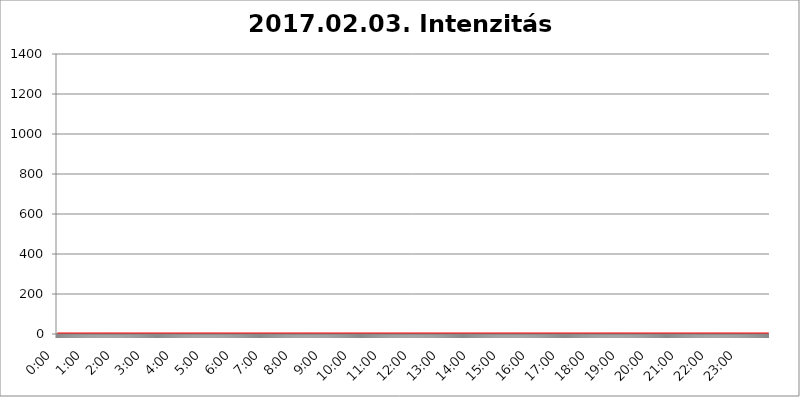
| Category | 2017.02.03. Intenzitás [W/m^2] |
|---|---|
| 0.0 | 0 |
| 0.0006944444444444445 | 0 |
| 0.001388888888888889 | 0 |
| 0.0020833333333333333 | 0 |
| 0.002777777777777778 | 0 |
| 0.003472222222222222 | 0 |
| 0.004166666666666667 | 0 |
| 0.004861111111111111 | 0 |
| 0.005555555555555556 | 0 |
| 0.0062499999999999995 | 0 |
| 0.006944444444444444 | 0 |
| 0.007638888888888889 | 0 |
| 0.008333333333333333 | 0 |
| 0.009027777777777779 | 0 |
| 0.009722222222222222 | 0 |
| 0.010416666666666666 | 0 |
| 0.011111111111111112 | 0 |
| 0.011805555555555555 | 0 |
| 0.012499999999999999 | 0 |
| 0.013194444444444444 | 0 |
| 0.013888888888888888 | 0 |
| 0.014583333333333332 | 0 |
| 0.015277777777777777 | 0 |
| 0.015972222222222224 | 0 |
| 0.016666666666666666 | 0 |
| 0.017361111111111112 | 0 |
| 0.018055555555555557 | 0 |
| 0.01875 | 0 |
| 0.019444444444444445 | 0 |
| 0.02013888888888889 | 0 |
| 0.020833333333333332 | 0 |
| 0.02152777777777778 | 0 |
| 0.022222222222222223 | 0 |
| 0.02291666666666667 | 0 |
| 0.02361111111111111 | 0 |
| 0.024305555555555556 | 0 |
| 0.024999999999999998 | 0 |
| 0.025694444444444447 | 0 |
| 0.02638888888888889 | 0 |
| 0.027083333333333334 | 0 |
| 0.027777777777777776 | 0 |
| 0.02847222222222222 | 0 |
| 0.029166666666666664 | 0 |
| 0.029861111111111113 | 0 |
| 0.030555555555555555 | 0 |
| 0.03125 | 0 |
| 0.03194444444444445 | 0 |
| 0.03263888888888889 | 0 |
| 0.03333333333333333 | 0 |
| 0.034027777777777775 | 0 |
| 0.034722222222222224 | 0 |
| 0.035416666666666666 | 0 |
| 0.036111111111111115 | 0 |
| 0.03680555555555556 | 0 |
| 0.0375 | 0 |
| 0.03819444444444444 | 0 |
| 0.03888888888888889 | 0 |
| 0.03958333333333333 | 0 |
| 0.04027777777777778 | 0 |
| 0.04097222222222222 | 0 |
| 0.041666666666666664 | 0 |
| 0.042361111111111106 | 0 |
| 0.04305555555555556 | 0 |
| 0.043750000000000004 | 0 |
| 0.044444444444444446 | 0 |
| 0.04513888888888889 | 0 |
| 0.04583333333333334 | 0 |
| 0.04652777777777778 | 0 |
| 0.04722222222222222 | 0 |
| 0.04791666666666666 | 0 |
| 0.04861111111111111 | 0 |
| 0.049305555555555554 | 0 |
| 0.049999999999999996 | 0 |
| 0.05069444444444445 | 0 |
| 0.051388888888888894 | 0 |
| 0.052083333333333336 | 0 |
| 0.05277777777777778 | 0 |
| 0.05347222222222222 | 0 |
| 0.05416666666666667 | 0 |
| 0.05486111111111111 | 0 |
| 0.05555555555555555 | 0 |
| 0.05625 | 0 |
| 0.05694444444444444 | 0 |
| 0.057638888888888885 | 0 |
| 0.05833333333333333 | 0 |
| 0.05902777777777778 | 0 |
| 0.059722222222222225 | 0 |
| 0.06041666666666667 | 0 |
| 0.061111111111111116 | 0 |
| 0.06180555555555556 | 0 |
| 0.0625 | 0 |
| 0.06319444444444444 | 0 |
| 0.06388888888888888 | 0 |
| 0.06458333333333334 | 0 |
| 0.06527777777777778 | 0 |
| 0.06597222222222222 | 0 |
| 0.06666666666666667 | 0 |
| 0.06736111111111111 | 0 |
| 0.06805555555555555 | 0 |
| 0.06874999999999999 | 0 |
| 0.06944444444444443 | 0 |
| 0.07013888888888889 | 0 |
| 0.07083333333333333 | 0 |
| 0.07152777777777779 | 0 |
| 0.07222222222222223 | 0 |
| 0.07291666666666667 | 0 |
| 0.07361111111111111 | 0 |
| 0.07430555555555556 | 0 |
| 0.075 | 0 |
| 0.07569444444444444 | 0 |
| 0.0763888888888889 | 0 |
| 0.07708333333333334 | 0 |
| 0.07777777777777778 | 0 |
| 0.07847222222222222 | 0 |
| 0.07916666666666666 | 0 |
| 0.0798611111111111 | 0 |
| 0.08055555555555556 | 0 |
| 0.08125 | 0 |
| 0.08194444444444444 | 0 |
| 0.08263888888888889 | 0 |
| 0.08333333333333333 | 0 |
| 0.08402777777777777 | 0 |
| 0.08472222222222221 | 0 |
| 0.08541666666666665 | 0 |
| 0.08611111111111112 | 0 |
| 0.08680555555555557 | 0 |
| 0.08750000000000001 | 0 |
| 0.08819444444444445 | 0 |
| 0.08888888888888889 | 0 |
| 0.08958333333333333 | 0 |
| 0.09027777777777778 | 0 |
| 0.09097222222222222 | 0 |
| 0.09166666666666667 | 0 |
| 0.09236111111111112 | 0 |
| 0.09305555555555556 | 0 |
| 0.09375 | 0 |
| 0.09444444444444444 | 0 |
| 0.09513888888888888 | 0 |
| 0.09583333333333333 | 0 |
| 0.09652777777777777 | 0 |
| 0.09722222222222222 | 0 |
| 0.09791666666666667 | 0 |
| 0.09861111111111111 | 0 |
| 0.09930555555555555 | 0 |
| 0.09999999999999999 | 0 |
| 0.10069444444444443 | 0 |
| 0.1013888888888889 | 0 |
| 0.10208333333333335 | 0 |
| 0.10277777777777779 | 0 |
| 0.10347222222222223 | 0 |
| 0.10416666666666667 | 0 |
| 0.10486111111111111 | 0 |
| 0.10555555555555556 | 0 |
| 0.10625 | 0 |
| 0.10694444444444444 | 0 |
| 0.1076388888888889 | 0 |
| 0.10833333333333334 | 0 |
| 0.10902777777777778 | 0 |
| 0.10972222222222222 | 0 |
| 0.1111111111111111 | 0 |
| 0.11180555555555556 | 0 |
| 0.11180555555555556 | 0 |
| 0.1125 | 0 |
| 0.11319444444444444 | 0 |
| 0.11388888888888889 | 0 |
| 0.11458333333333333 | 0 |
| 0.11527777777777777 | 0 |
| 0.11597222222222221 | 0 |
| 0.11666666666666665 | 0 |
| 0.1173611111111111 | 0 |
| 0.11805555555555557 | 0 |
| 0.11944444444444445 | 0 |
| 0.12013888888888889 | 0 |
| 0.12083333333333333 | 0 |
| 0.12152777777777778 | 0 |
| 0.12222222222222223 | 0 |
| 0.12291666666666667 | 0 |
| 0.12291666666666667 | 0 |
| 0.12361111111111112 | 0 |
| 0.12430555555555556 | 0 |
| 0.125 | 0 |
| 0.12569444444444444 | 0 |
| 0.12638888888888888 | 0 |
| 0.12708333333333333 | 0 |
| 0.16875 | 0 |
| 0.12847222222222224 | 0 |
| 0.12916666666666668 | 0 |
| 0.12986111111111112 | 0 |
| 0.13055555555555556 | 0 |
| 0.13125 | 0 |
| 0.13194444444444445 | 0 |
| 0.1326388888888889 | 0 |
| 0.13333333333333333 | 0 |
| 0.13402777777777777 | 0 |
| 0.13402777777777777 | 0 |
| 0.13472222222222222 | 0 |
| 0.13541666666666666 | 0 |
| 0.1361111111111111 | 0 |
| 0.13749999999999998 | 0 |
| 0.13819444444444443 | 0 |
| 0.1388888888888889 | 0 |
| 0.13958333333333334 | 0 |
| 0.14027777777777778 | 0 |
| 0.14097222222222222 | 0 |
| 0.14166666666666666 | 0 |
| 0.1423611111111111 | 0 |
| 0.14305555555555557 | 0 |
| 0.14375000000000002 | 0 |
| 0.14444444444444446 | 0 |
| 0.1451388888888889 | 0 |
| 0.1451388888888889 | 0 |
| 0.14652777777777778 | 0 |
| 0.14722222222222223 | 0 |
| 0.14791666666666667 | 0 |
| 0.1486111111111111 | 0 |
| 0.14930555555555555 | 0 |
| 0.15 | 0 |
| 0.15069444444444444 | 0 |
| 0.15138888888888888 | 0 |
| 0.15208333333333332 | 0 |
| 0.15277777777777776 | 0 |
| 0.15347222222222223 | 0 |
| 0.15416666666666667 | 0 |
| 0.15486111111111112 | 0 |
| 0.15555555555555556 | 0 |
| 0.15625 | 0 |
| 0.15694444444444444 | 0 |
| 0.15763888888888888 | 0 |
| 0.15833333333333333 | 0 |
| 0.15902777777777777 | 0 |
| 0.15972222222222224 | 0 |
| 0.16041666666666668 | 0 |
| 0.16111111111111112 | 0 |
| 0.16180555555555556 | 0 |
| 0.1625 | 0 |
| 0.16319444444444445 | 0 |
| 0.1638888888888889 | 0 |
| 0.16458333333333333 | 0 |
| 0.16527777777777777 | 0 |
| 0.16597222222222222 | 0 |
| 0.16666666666666666 | 0 |
| 0.1673611111111111 | 0 |
| 0.16805555555555554 | 0 |
| 0.16874999999999998 | 0 |
| 0.16944444444444443 | 0 |
| 0.17013888888888887 | 0 |
| 0.1708333333333333 | 0 |
| 0.17152777777777775 | 0 |
| 0.17222222222222225 | 0 |
| 0.1729166666666667 | 0 |
| 0.17361111111111113 | 0 |
| 0.17430555555555557 | 0 |
| 0.17500000000000002 | 0 |
| 0.17569444444444446 | 0 |
| 0.1763888888888889 | 0 |
| 0.17708333333333334 | 0 |
| 0.17777777777777778 | 0 |
| 0.17847222222222223 | 0 |
| 0.17916666666666667 | 0 |
| 0.1798611111111111 | 0 |
| 0.18055555555555555 | 0 |
| 0.18125 | 0 |
| 0.18194444444444444 | 0 |
| 0.1826388888888889 | 0 |
| 0.18333333333333335 | 0 |
| 0.1840277777777778 | 0 |
| 0.18472222222222223 | 0 |
| 0.18541666666666667 | 0 |
| 0.18611111111111112 | 0 |
| 0.18680555555555556 | 0 |
| 0.1875 | 0 |
| 0.18819444444444444 | 0 |
| 0.18888888888888888 | 0 |
| 0.18958333333333333 | 0 |
| 0.19027777777777777 | 0 |
| 0.1909722222222222 | 0 |
| 0.19166666666666665 | 0 |
| 0.19236111111111112 | 0 |
| 0.19305555555555554 | 0 |
| 0.19375 | 0 |
| 0.19444444444444445 | 0 |
| 0.1951388888888889 | 0 |
| 0.19583333333333333 | 0 |
| 0.19652777777777777 | 0 |
| 0.19722222222222222 | 0 |
| 0.19791666666666666 | 0 |
| 0.1986111111111111 | 0 |
| 0.19930555555555554 | 0 |
| 0.19999999999999998 | 0 |
| 0.20069444444444443 | 0 |
| 0.20138888888888887 | 0 |
| 0.2020833333333333 | 0 |
| 0.2027777777777778 | 0 |
| 0.2034722222222222 | 0 |
| 0.2041666666666667 | 0 |
| 0.20486111111111113 | 0 |
| 0.20555555555555557 | 0 |
| 0.20625000000000002 | 0 |
| 0.20694444444444446 | 0 |
| 0.2076388888888889 | 0 |
| 0.20833333333333334 | 0 |
| 0.20902777777777778 | 0 |
| 0.20972222222222223 | 0 |
| 0.21041666666666667 | 0 |
| 0.2111111111111111 | 0 |
| 0.21180555555555555 | 0 |
| 0.2125 | 0 |
| 0.21319444444444444 | 0 |
| 0.2138888888888889 | 0 |
| 0.21458333333333335 | 0 |
| 0.2152777777777778 | 0 |
| 0.21597222222222223 | 0 |
| 0.21666666666666667 | 0 |
| 0.21736111111111112 | 0 |
| 0.21805555555555556 | 0 |
| 0.21875 | 0 |
| 0.21944444444444444 | 0 |
| 0.22013888888888888 | 0 |
| 0.22083333333333333 | 0 |
| 0.22152777777777777 | 0 |
| 0.2222222222222222 | 0 |
| 0.22291666666666665 | 0 |
| 0.2236111111111111 | 0 |
| 0.22430555555555556 | 0 |
| 0.225 | 0 |
| 0.22569444444444445 | 0 |
| 0.2263888888888889 | 0 |
| 0.22708333333333333 | 0 |
| 0.22777777777777777 | 0 |
| 0.22847222222222222 | 0 |
| 0.22916666666666666 | 0 |
| 0.2298611111111111 | 0 |
| 0.23055555555555554 | 0 |
| 0.23124999999999998 | 0 |
| 0.23194444444444443 | 0 |
| 0.23263888888888887 | 0 |
| 0.2333333333333333 | 0 |
| 0.2340277777777778 | 0 |
| 0.2347222222222222 | 0 |
| 0.2354166666666667 | 0 |
| 0.23611111111111113 | 0 |
| 0.23680555555555557 | 0 |
| 0.23750000000000002 | 0 |
| 0.23819444444444446 | 0 |
| 0.2388888888888889 | 0 |
| 0.23958333333333334 | 0 |
| 0.24027777777777778 | 0 |
| 0.24097222222222223 | 0 |
| 0.24166666666666667 | 0 |
| 0.2423611111111111 | 0 |
| 0.24305555555555555 | 0 |
| 0.24375 | 0 |
| 0.24444444444444446 | 0 |
| 0.24513888888888888 | 0 |
| 0.24583333333333335 | 0 |
| 0.2465277777777778 | 0 |
| 0.24722222222222223 | 0 |
| 0.24791666666666667 | 0 |
| 0.24861111111111112 | 0 |
| 0.24930555555555556 | 0 |
| 0.25 | 0 |
| 0.25069444444444444 | 0 |
| 0.2513888888888889 | 0 |
| 0.2520833333333333 | 0 |
| 0.25277777777777777 | 0 |
| 0.2534722222222222 | 0 |
| 0.25416666666666665 | 0 |
| 0.2548611111111111 | 0 |
| 0.2555555555555556 | 0 |
| 0.25625000000000003 | 0 |
| 0.2569444444444445 | 0 |
| 0.2576388888888889 | 0 |
| 0.25833333333333336 | 0 |
| 0.2590277777777778 | 0 |
| 0.25972222222222224 | 0 |
| 0.2604166666666667 | 0 |
| 0.2611111111111111 | 0 |
| 0.26180555555555557 | 0 |
| 0.2625 | 0 |
| 0.26319444444444445 | 0 |
| 0.2638888888888889 | 0 |
| 0.26458333333333334 | 0 |
| 0.2652777777777778 | 0 |
| 0.2659722222222222 | 0 |
| 0.26666666666666666 | 0 |
| 0.2673611111111111 | 0 |
| 0.26805555555555555 | 0 |
| 0.26875 | 0 |
| 0.26944444444444443 | 0 |
| 0.2701388888888889 | 0 |
| 0.2708333333333333 | 0 |
| 0.27152777777777776 | 0 |
| 0.2722222222222222 | 0 |
| 0.27291666666666664 | 0 |
| 0.2736111111111111 | 0 |
| 0.2743055555555555 | 0 |
| 0.27499999999999997 | 0 |
| 0.27569444444444446 | 0 |
| 0.27638888888888885 | 0 |
| 0.27708333333333335 | 0 |
| 0.2777777777777778 | 0 |
| 0.27847222222222223 | 0 |
| 0.2791666666666667 | 0 |
| 0.2798611111111111 | 0 |
| 0.28055555555555556 | 0 |
| 0.28125 | 0 |
| 0.28194444444444444 | 0 |
| 0.2826388888888889 | 0 |
| 0.2833333333333333 | 0 |
| 0.28402777777777777 | 0 |
| 0.2847222222222222 | 0 |
| 0.28541666666666665 | 0 |
| 0.28611111111111115 | 0 |
| 0.28680555555555554 | 0 |
| 0.28750000000000003 | 0 |
| 0.2881944444444445 | 0 |
| 0.2888888888888889 | 0 |
| 0.28958333333333336 | 0 |
| 0.2902777777777778 | 0 |
| 0.29097222222222224 | 0 |
| 0.2916666666666667 | 0 |
| 0.2923611111111111 | 0 |
| 0.29305555555555557 | 0 |
| 0.29375 | 0 |
| 0.29444444444444445 | 0 |
| 0.2951388888888889 | 0 |
| 0.29583333333333334 | 0 |
| 0.2965277777777778 | 0 |
| 0.2972222222222222 | 0 |
| 0.29791666666666666 | 0 |
| 0.2986111111111111 | 0 |
| 0.29930555555555555 | 0 |
| 0.3 | 0 |
| 0.30069444444444443 | 0 |
| 0.3013888888888889 | 0 |
| 0.3020833333333333 | 0 |
| 0.30277777777777776 | 0 |
| 0.3034722222222222 | 0 |
| 0.30416666666666664 | 0 |
| 0.3048611111111111 | 0 |
| 0.3055555555555555 | 0 |
| 0.30624999999999997 | 0 |
| 0.3069444444444444 | 0 |
| 0.3076388888888889 | 0 |
| 0.30833333333333335 | 0 |
| 0.3090277777777778 | 0 |
| 0.30972222222222223 | 0 |
| 0.3104166666666667 | 0 |
| 0.3111111111111111 | 0 |
| 0.31180555555555556 | 0 |
| 0.3125 | 0 |
| 0.31319444444444444 | 0 |
| 0.3138888888888889 | 0 |
| 0.3145833333333333 | 0 |
| 0.31527777777777777 | 0 |
| 0.3159722222222222 | 0 |
| 0.31666666666666665 | 0 |
| 0.31736111111111115 | 0 |
| 0.31805555555555554 | 0 |
| 0.31875000000000003 | 0 |
| 0.3194444444444445 | 0 |
| 0.3201388888888889 | 0 |
| 0.32083333333333336 | 0 |
| 0.3215277777777778 | 0 |
| 0.32222222222222224 | 0 |
| 0.3229166666666667 | 0 |
| 0.3236111111111111 | 0 |
| 0.32430555555555557 | 0 |
| 0.325 | 0 |
| 0.32569444444444445 | 0 |
| 0.3263888888888889 | 0 |
| 0.32708333333333334 | 0 |
| 0.3277777777777778 | 0 |
| 0.3284722222222222 | 0 |
| 0.32916666666666666 | 0 |
| 0.3298611111111111 | 0 |
| 0.33055555555555555 | 0 |
| 0.33125 | 0 |
| 0.33194444444444443 | 0 |
| 0.3326388888888889 | 0 |
| 0.3333333333333333 | 0 |
| 0.3340277777777778 | 0 |
| 0.3347222222222222 | 0 |
| 0.3354166666666667 | 0 |
| 0.3361111111111111 | 0 |
| 0.3368055555555556 | 0 |
| 0.33749999999999997 | 0 |
| 0.33819444444444446 | 0 |
| 0.33888888888888885 | 0 |
| 0.33958333333333335 | 0 |
| 0.34027777777777773 | 0 |
| 0.34097222222222223 | 0 |
| 0.3416666666666666 | 0 |
| 0.3423611111111111 | 0 |
| 0.3430555555555555 | 0 |
| 0.34375 | 0 |
| 0.3444444444444445 | 0 |
| 0.3451388888888889 | 0 |
| 0.3458333333333334 | 0 |
| 0.34652777777777777 | 0 |
| 0.34722222222222227 | 0 |
| 0.34791666666666665 | 0 |
| 0.34861111111111115 | 0 |
| 0.34930555555555554 | 0 |
| 0.35000000000000003 | 0 |
| 0.3506944444444444 | 0 |
| 0.3513888888888889 | 0 |
| 0.3520833333333333 | 0 |
| 0.3527777777777778 | 0 |
| 0.3534722222222222 | 0 |
| 0.3541666666666667 | 0 |
| 0.3548611111111111 | 0 |
| 0.35555555555555557 | 0 |
| 0.35625 | 0 |
| 0.35694444444444445 | 0 |
| 0.3576388888888889 | 0 |
| 0.35833333333333334 | 0 |
| 0.3590277777777778 | 0 |
| 0.3597222222222222 | 0 |
| 0.36041666666666666 | 0 |
| 0.3611111111111111 | 0 |
| 0.36180555555555555 | 0 |
| 0.3625 | 0 |
| 0.36319444444444443 | 0 |
| 0.3638888888888889 | 0 |
| 0.3645833333333333 | 0 |
| 0.3652777777777778 | 0 |
| 0.3659722222222222 | 0 |
| 0.3666666666666667 | 0 |
| 0.3673611111111111 | 0 |
| 0.3680555555555556 | 0 |
| 0.36874999999999997 | 0 |
| 0.36944444444444446 | 0 |
| 0.37013888888888885 | 0 |
| 0.37083333333333335 | 0 |
| 0.37152777777777773 | 0 |
| 0.37222222222222223 | 0 |
| 0.3729166666666666 | 0 |
| 0.3736111111111111 | 0 |
| 0.3743055555555555 | 0 |
| 0.375 | 0 |
| 0.3756944444444445 | 0 |
| 0.3763888888888889 | 0 |
| 0.3770833333333334 | 0 |
| 0.37777777777777777 | 0 |
| 0.37847222222222227 | 0 |
| 0.37916666666666665 | 0 |
| 0.37986111111111115 | 0 |
| 0.38055555555555554 | 0 |
| 0.38125000000000003 | 0 |
| 0.3819444444444444 | 0 |
| 0.3826388888888889 | 0 |
| 0.3833333333333333 | 0 |
| 0.3840277777777778 | 0 |
| 0.3847222222222222 | 0 |
| 0.3854166666666667 | 0 |
| 0.3861111111111111 | 0 |
| 0.38680555555555557 | 0 |
| 0.3875 | 0 |
| 0.38819444444444445 | 0 |
| 0.3888888888888889 | 0 |
| 0.38958333333333334 | 0 |
| 0.3902777777777778 | 0 |
| 0.3909722222222222 | 0 |
| 0.39166666666666666 | 0 |
| 0.3923611111111111 | 0 |
| 0.39305555555555555 | 0 |
| 0.39375 | 0 |
| 0.39444444444444443 | 0 |
| 0.3951388888888889 | 0 |
| 0.3958333333333333 | 0 |
| 0.3965277777777778 | 0 |
| 0.3972222222222222 | 0 |
| 0.3979166666666667 | 0 |
| 0.3986111111111111 | 0 |
| 0.3993055555555556 | 0 |
| 0.39999999999999997 | 0 |
| 0.40069444444444446 | 0 |
| 0.40138888888888885 | 0 |
| 0.40208333333333335 | 0 |
| 0.40277777777777773 | 0 |
| 0.40347222222222223 | 0 |
| 0.4041666666666666 | 0 |
| 0.4048611111111111 | 0 |
| 0.4055555555555555 | 0 |
| 0.40625 | 0 |
| 0.4069444444444445 | 0 |
| 0.4076388888888889 | 0 |
| 0.4083333333333334 | 0 |
| 0.40902777777777777 | 0 |
| 0.40972222222222227 | 0 |
| 0.41041666666666665 | 0 |
| 0.41111111111111115 | 0 |
| 0.41180555555555554 | 0 |
| 0.41250000000000003 | 0 |
| 0.4131944444444444 | 0 |
| 0.4138888888888889 | 0 |
| 0.4145833333333333 | 0 |
| 0.4152777777777778 | 0 |
| 0.4159722222222222 | 0 |
| 0.4166666666666667 | 0 |
| 0.4173611111111111 | 0 |
| 0.41805555555555557 | 0 |
| 0.41875 | 0 |
| 0.41944444444444445 | 0 |
| 0.4201388888888889 | 0 |
| 0.42083333333333334 | 0 |
| 0.4215277777777778 | 0 |
| 0.4222222222222222 | 0 |
| 0.42291666666666666 | 0 |
| 0.4236111111111111 | 0 |
| 0.42430555555555555 | 0 |
| 0.425 | 0 |
| 0.42569444444444443 | 0 |
| 0.4263888888888889 | 0 |
| 0.4270833333333333 | 0 |
| 0.4277777777777778 | 0 |
| 0.4284722222222222 | 0 |
| 0.4291666666666667 | 0 |
| 0.4298611111111111 | 0 |
| 0.4305555555555556 | 0 |
| 0.43124999999999997 | 0 |
| 0.43194444444444446 | 0 |
| 0.43263888888888885 | 0 |
| 0.43333333333333335 | 0 |
| 0.43402777777777773 | 0 |
| 0.43472222222222223 | 0 |
| 0.4354166666666666 | 0 |
| 0.4361111111111111 | 0 |
| 0.4368055555555555 | 0 |
| 0.4375 | 0 |
| 0.4381944444444445 | 0 |
| 0.4388888888888889 | 0 |
| 0.4395833333333334 | 0 |
| 0.44027777777777777 | 0 |
| 0.44097222222222227 | 0 |
| 0.44166666666666665 | 0 |
| 0.44236111111111115 | 0 |
| 0.44305555555555554 | 0 |
| 0.44375000000000003 | 0 |
| 0.4444444444444444 | 0 |
| 0.4451388888888889 | 0 |
| 0.4458333333333333 | 0 |
| 0.4465277777777778 | 0 |
| 0.4472222222222222 | 0 |
| 0.4479166666666667 | 0 |
| 0.4486111111111111 | 0 |
| 0.44930555555555557 | 0 |
| 0.45 | 0 |
| 0.45069444444444445 | 0 |
| 0.4513888888888889 | 0 |
| 0.45208333333333334 | 0 |
| 0.4527777777777778 | 0 |
| 0.4534722222222222 | 0 |
| 0.45416666666666666 | 0 |
| 0.4548611111111111 | 0 |
| 0.45555555555555555 | 0 |
| 0.45625 | 0 |
| 0.45694444444444443 | 0 |
| 0.4576388888888889 | 0 |
| 0.4583333333333333 | 0 |
| 0.4590277777777778 | 0 |
| 0.4597222222222222 | 0 |
| 0.4604166666666667 | 0 |
| 0.4611111111111111 | 0 |
| 0.4618055555555556 | 0 |
| 0.46249999999999997 | 0 |
| 0.46319444444444446 | 0 |
| 0.46388888888888885 | 0 |
| 0.46458333333333335 | 0 |
| 0.46527777777777773 | 0 |
| 0.46597222222222223 | 0 |
| 0.4666666666666666 | 0 |
| 0.4673611111111111 | 0 |
| 0.4680555555555555 | 0 |
| 0.46875 | 0 |
| 0.4694444444444445 | 0 |
| 0.4701388888888889 | 0 |
| 0.4708333333333334 | 0 |
| 0.47152777777777777 | 0 |
| 0.47222222222222227 | 0 |
| 0.47291666666666665 | 0 |
| 0.47361111111111115 | 0 |
| 0.47430555555555554 | 0 |
| 0.47500000000000003 | 0 |
| 0.4756944444444444 | 0 |
| 0.4763888888888889 | 0 |
| 0.4770833333333333 | 0 |
| 0.4777777777777778 | 0 |
| 0.4784722222222222 | 0 |
| 0.4791666666666667 | 0 |
| 0.4798611111111111 | 0 |
| 0.48055555555555557 | 0 |
| 0.48125 | 0 |
| 0.48194444444444445 | 0 |
| 0.4826388888888889 | 0 |
| 0.48333333333333334 | 0 |
| 0.4840277777777778 | 0 |
| 0.4847222222222222 | 0 |
| 0.48541666666666666 | 0 |
| 0.4861111111111111 | 0 |
| 0.48680555555555555 | 0 |
| 0.4875 | 0 |
| 0.48819444444444443 | 0 |
| 0.4888888888888889 | 0 |
| 0.4895833333333333 | 0 |
| 0.4902777777777778 | 0 |
| 0.4909722222222222 | 0 |
| 0.4916666666666667 | 0 |
| 0.4923611111111111 | 0 |
| 0.4930555555555556 | 0 |
| 0.49374999999999997 | 0 |
| 0.49444444444444446 | 0 |
| 0.49513888888888885 | 0 |
| 0.49583333333333335 | 0 |
| 0.49652777777777773 | 0 |
| 0.49722222222222223 | 0 |
| 0.4979166666666666 | 0 |
| 0.4986111111111111 | 0 |
| 0.4993055555555555 | 0 |
| 0.5 | 0 |
| 0.5006944444444444 | 0 |
| 0.5013888888888889 | 0 |
| 0.5020833333333333 | 0 |
| 0.5027777777777778 | 0 |
| 0.5034722222222222 | 0 |
| 0.5041666666666667 | 0 |
| 0.5048611111111111 | 0 |
| 0.5055555555555555 | 0 |
| 0.50625 | 0 |
| 0.5069444444444444 | 0 |
| 0.5076388888888889 | 0 |
| 0.5083333333333333 | 0 |
| 0.5090277777777777 | 0 |
| 0.5097222222222222 | 0 |
| 0.5104166666666666 | 0 |
| 0.5111111111111112 | 0 |
| 0.5118055555555555 | 0 |
| 0.5125000000000001 | 0 |
| 0.5131944444444444 | 0 |
| 0.513888888888889 | 0 |
| 0.5145833333333333 | 0 |
| 0.5152777777777778 | 0 |
| 0.5159722222222222 | 0 |
| 0.5166666666666667 | 0 |
| 0.517361111111111 | 0 |
| 0.5180555555555556 | 0 |
| 0.5187499999999999 | 0 |
| 0.5194444444444445 | 0 |
| 0.5201388888888888 | 0 |
| 0.5208333333333334 | 0 |
| 0.5215277777777778 | 0 |
| 0.5222222222222223 | 0 |
| 0.5229166666666667 | 0 |
| 0.5236111111111111 | 0 |
| 0.5243055555555556 | 0 |
| 0.525 | 0 |
| 0.5256944444444445 | 0 |
| 0.5263888888888889 | 0 |
| 0.5270833333333333 | 0 |
| 0.5277777777777778 | 0 |
| 0.5284722222222222 | 0 |
| 0.5291666666666667 | 0 |
| 0.5298611111111111 | 0 |
| 0.5305555555555556 | 0 |
| 0.53125 | 0 |
| 0.5319444444444444 | 0 |
| 0.5326388888888889 | 0 |
| 0.5333333333333333 | 0 |
| 0.5340277777777778 | 0 |
| 0.5347222222222222 | 0 |
| 0.5354166666666667 | 0 |
| 0.5361111111111111 | 0 |
| 0.5368055555555555 | 0 |
| 0.5375 | 0 |
| 0.5381944444444444 | 0 |
| 0.5388888888888889 | 0 |
| 0.5395833333333333 | 0 |
| 0.5402777777777777 | 0 |
| 0.5409722222222222 | 0 |
| 0.5416666666666666 | 0 |
| 0.5423611111111112 | 0 |
| 0.5430555555555555 | 0 |
| 0.5437500000000001 | 0 |
| 0.5444444444444444 | 0 |
| 0.545138888888889 | 0 |
| 0.5458333333333333 | 0 |
| 0.5465277777777778 | 0 |
| 0.5472222222222222 | 0 |
| 0.5479166666666667 | 0 |
| 0.548611111111111 | 0 |
| 0.5493055555555556 | 0 |
| 0.5499999999999999 | 0 |
| 0.5506944444444445 | 0 |
| 0.5513888888888888 | 0 |
| 0.5520833333333334 | 0 |
| 0.5527777777777778 | 0 |
| 0.5534722222222223 | 0 |
| 0.5541666666666667 | 0 |
| 0.5548611111111111 | 0 |
| 0.5555555555555556 | 0 |
| 0.55625 | 0 |
| 0.5569444444444445 | 0 |
| 0.5576388888888889 | 0 |
| 0.5583333333333333 | 0 |
| 0.5590277777777778 | 0 |
| 0.5597222222222222 | 0 |
| 0.5604166666666667 | 0 |
| 0.5611111111111111 | 0 |
| 0.5618055555555556 | 0 |
| 0.5625 | 0 |
| 0.5631944444444444 | 0 |
| 0.5638888888888889 | 0 |
| 0.5645833333333333 | 0 |
| 0.5652777777777778 | 0 |
| 0.5659722222222222 | 0 |
| 0.5666666666666667 | 0 |
| 0.5673611111111111 | 0 |
| 0.5680555555555555 | 0 |
| 0.56875 | 0 |
| 0.5694444444444444 | 0 |
| 0.5701388888888889 | 0 |
| 0.5708333333333333 | 0 |
| 0.5715277777777777 | 0 |
| 0.5722222222222222 | 0 |
| 0.5729166666666666 | 0 |
| 0.5736111111111112 | 0 |
| 0.5743055555555555 | 0 |
| 0.5750000000000001 | 0 |
| 0.5756944444444444 | 0 |
| 0.576388888888889 | 0 |
| 0.5770833333333333 | 0 |
| 0.5777777777777778 | 0 |
| 0.5784722222222222 | 0 |
| 0.5791666666666667 | 0 |
| 0.579861111111111 | 0 |
| 0.5805555555555556 | 0 |
| 0.5812499999999999 | 0 |
| 0.5819444444444445 | 0 |
| 0.5826388888888888 | 0 |
| 0.5833333333333334 | 0 |
| 0.5840277777777778 | 0 |
| 0.5847222222222223 | 0 |
| 0.5854166666666667 | 0 |
| 0.5861111111111111 | 0 |
| 0.5868055555555556 | 0 |
| 0.5875 | 0 |
| 0.5881944444444445 | 0 |
| 0.5888888888888889 | 0 |
| 0.5895833333333333 | 0 |
| 0.5902777777777778 | 0 |
| 0.5909722222222222 | 0 |
| 0.5916666666666667 | 0 |
| 0.5923611111111111 | 0 |
| 0.5930555555555556 | 0 |
| 0.59375 | 0 |
| 0.5944444444444444 | 0 |
| 0.5951388888888889 | 0 |
| 0.5958333333333333 | 0 |
| 0.5965277777777778 | 0 |
| 0.5972222222222222 | 0 |
| 0.5979166666666667 | 0 |
| 0.5986111111111111 | 0 |
| 0.5993055555555555 | 0 |
| 0.6 | 0 |
| 0.6006944444444444 | 0 |
| 0.6013888888888889 | 0 |
| 0.6020833333333333 | 0 |
| 0.6027777777777777 | 0 |
| 0.6034722222222222 | 0 |
| 0.6041666666666666 | 0 |
| 0.6048611111111112 | 0 |
| 0.6055555555555555 | 0 |
| 0.6062500000000001 | 0 |
| 0.6069444444444444 | 0 |
| 0.607638888888889 | 0 |
| 0.6083333333333333 | 0 |
| 0.6090277777777778 | 0 |
| 0.6097222222222222 | 0 |
| 0.6104166666666667 | 0 |
| 0.611111111111111 | 0 |
| 0.6118055555555556 | 0 |
| 0.6124999999999999 | 0 |
| 0.6131944444444445 | 0 |
| 0.6138888888888888 | 0 |
| 0.6145833333333334 | 0 |
| 0.6152777777777778 | 0 |
| 0.6159722222222223 | 0 |
| 0.6166666666666667 | 0 |
| 0.6173611111111111 | 0 |
| 0.6180555555555556 | 0 |
| 0.61875 | 0 |
| 0.6194444444444445 | 0 |
| 0.6201388888888889 | 0 |
| 0.6208333333333333 | 0 |
| 0.6215277777777778 | 0 |
| 0.6222222222222222 | 0 |
| 0.6229166666666667 | 0 |
| 0.6236111111111111 | 0 |
| 0.6243055555555556 | 0 |
| 0.625 | 0 |
| 0.6256944444444444 | 0 |
| 0.6263888888888889 | 0 |
| 0.6270833333333333 | 0 |
| 0.6277777777777778 | 0 |
| 0.6284722222222222 | 0 |
| 0.6291666666666667 | 0 |
| 0.6298611111111111 | 0 |
| 0.6305555555555555 | 0 |
| 0.63125 | 0 |
| 0.6319444444444444 | 0 |
| 0.6326388888888889 | 0 |
| 0.6333333333333333 | 0 |
| 0.6340277777777777 | 0 |
| 0.6347222222222222 | 0 |
| 0.6354166666666666 | 0 |
| 0.6361111111111112 | 0 |
| 0.6368055555555555 | 0 |
| 0.6375000000000001 | 0 |
| 0.6381944444444444 | 0 |
| 0.638888888888889 | 0 |
| 0.6395833333333333 | 0 |
| 0.6402777777777778 | 0 |
| 0.6409722222222222 | 0 |
| 0.6416666666666667 | 0 |
| 0.642361111111111 | 0 |
| 0.6430555555555556 | 0 |
| 0.6437499999999999 | 0 |
| 0.6444444444444445 | 0 |
| 0.6451388888888888 | 0 |
| 0.6458333333333334 | 0 |
| 0.6465277777777778 | 0 |
| 0.6472222222222223 | 0 |
| 0.6479166666666667 | 0 |
| 0.6486111111111111 | 0 |
| 0.6493055555555556 | 0 |
| 0.65 | 0 |
| 0.6506944444444445 | 0 |
| 0.6513888888888889 | 0 |
| 0.6520833333333333 | 0 |
| 0.6527777777777778 | 0 |
| 0.6534722222222222 | 0 |
| 0.6541666666666667 | 0 |
| 0.6548611111111111 | 0 |
| 0.6555555555555556 | 0 |
| 0.65625 | 0 |
| 0.6569444444444444 | 0 |
| 0.6576388888888889 | 0 |
| 0.6583333333333333 | 0 |
| 0.6590277777777778 | 0 |
| 0.6597222222222222 | 0 |
| 0.6604166666666667 | 0 |
| 0.6611111111111111 | 0 |
| 0.6618055555555555 | 0 |
| 0.6625 | 0 |
| 0.6631944444444444 | 0 |
| 0.6638888888888889 | 0 |
| 0.6645833333333333 | 0 |
| 0.6652777777777777 | 0 |
| 0.6659722222222222 | 0 |
| 0.6666666666666666 | 0 |
| 0.6673611111111111 | 0 |
| 0.6680555555555556 | 0 |
| 0.6687500000000001 | 0 |
| 0.6694444444444444 | 0 |
| 0.6701388888888888 | 0 |
| 0.6708333333333334 | 0 |
| 0.6715277777777778 | 0 |
| 0.6722222222222222 | 0 |
| 0.6729166666666666 | 0 |
| 0.6736111111111112 | 0 |
| 0.6743055555555556 | 0 |
| 0.6749999999999999 | 0 |
| 0.6756944444444444 | 0 |
| 0.6763888888888889 | 0 |
| 0.6770833333333334 | 0 |
| 0.6777777777777777 | 0 |
| 0.6784722222222223 | 0 |
| 0.6791666666666667 | 0 |
| 0.6798611111111111 | 0 |
| 0.6805555555555555 | 0 |
| 0.68125 | 0 |
| 0.6819444444444445 | 0 |
| 0.6826388888888889 | 0 |
| 0.6833333333333332 | 0 |
| 0.6840277777777778 | 0 |
| 0.6847222222222222 | 0 |
| 0.6854166666666667 | 0 |
| 0.686111111111111 | 0 |
| 0.6868055555555556 | 0 |
| 0.6875 | 0 |
| 0.6881944444444444 | 0 |
| 0.688888888888889 | 0 |
| 0.6895833333333333 | 0 |
| 0.6902777777777778 | 0 |
| 0.6909722222222222 | 0 |
| 0.6916666666666668 | 0 |
| 0.6923611111111111 | 0 |
| 0.6930555555555555 | 0 |
| 0.69375 | 0 |
| 0.6944444444444445 | 0 |
| 0.6951388888888889 | 0 |
| 0.6958333333333333 | 0 |
| 0.6965277777777777 | 0 |
| 0.6972222222222223 | 0 |
| 0.6979166666666666 | 0 |
| 0.6986111111111111 | 0 |
| 0.6993055555555556 | 0 |
| 0.7000000000000001 | 0 |
| 0.7006944444444444 | 0 |
| 0.7013888888888888 | 0 |
| 0.7020833333333334 | 0 |
| 0.7027777777777778 | 0 |
| 0.7034722222222222 | 0 |
| 0.7041666666666666 | 0 |
| 0.7048611111111112 | 0 |
| 0.7055555555555556 | 0 |
| 0.7062499999999999 | 0 |
| 0.7069444444444444 | 0 |
| 0.7076388888888889 | 0 |
| 0.7083333333333334 | 0 |
| 0.7090277777777777 | 0 |
| 0.7097222222222223 | 0 |
| 0.7104166666666667 | 0 |
| 0.7111111111111111 | 0 |
| 0.7118055555555555 | 0 |
| 0.7125 | 0 |
| 0.7131944444444445 | 0 |
| 0.7138888888888889 | 0 |
| 0.7145833333333332 | 0 |
| 0.7152777777777778 | 0 |
| 0.7159722222222222 | 0 |
| 0.7166666666666667 | 0 |
| 0.717361111111111 | 0 |
| 0.7180555555555556 | 0 |
| 0.71875 | 0 |
| 0.7194444444444444 | 0 |
| 0.720138888888889 | 0 |
| 0.7208333333333333 | 0 |
| 0.7215277777777778 | 0 |
| 0.7222222222222222 | 0 |
| 0.7229166666666668 | 0 |
| 0.7236111111111111 | 0 |
| 0.7243055555555555 | 0 |
| 0.725 | 0 |
| 0.7256944444444445 | 0 |
| 0.7263888888888889 | 0 |
| 0.7270833333333333 | 0 |
| 0.7277777777777777 | 0 |
| 0.7284722222222223 | 0 |
| 0.7291666666666666 | 0 |
| 0.7298611111111111 | 0 |
| 0.7305555555555556 | 0 |
| 0.7312500000000001 | 0 |
| 0.7319444444444444 | 0 |
| 0.7326388888888888 | 0 |
| 0.7333333333333334 | 0 |
| 0.7340277777777778 | 0 |
| 0.7347222222222222 | 0 |
| 0.7354166666666666 | 0 |
| 0.7361111111111112 | 0 |
| 0.7368055555555556 | 0 |
| 0.7374999999999999 | 0 |
| 0.7381944444444444 | 0 |
| 0.7388888888888889 | 0 |
| 0.7395833333333334 | 0 |
| 0.7402777777777777 | 0 |
| 0.7409722222222223 | 0 |
| 0.7416666666666667 | 0 |
| 0.7423611111111111 | 0 |
| 0.7430555555555555 | 0 |
| 0.74375 | 0 |
| 0.7444444444444445 | 0 |
| 0.7451388888888889 | 0 |
| 0.7458333333333332 | 0 |
| 0.7465277777777778 | 0 |
| 0.7472222222222222 | 0 |
| 0.7479166666666667 | 0 |
| 0.748611111111111 | 0 |
| 0.7493055555555556 | 0 |
| 0.75 | 0 |
| 0.7506944444444444 | 0 |
| 0.751388888888889 | 0 |
| 0.7520833333333333 | 0 |
| 0.7527777777777778 | 0 |
| 0.7534722222222222 | 0 |
| 0.7541666666666668 | 0 |
| 0.7548611111111111 | 0 |
| 0.7555555555555555 | 0 |
| 0.75625 | 0 |
| 0.7569444444444445 | 0 |
| 0.7576388888888889 | 0 |
| 0.7583333333333333 | 0 |
| 0.7590277777777777 | 0 |
| 0.7597222222222223 | 0 |
| 0.7604166666666666 | 0 |
| 0.7611111111111111 | 0 |
| 0.7618055555555556 | 0 |
| 0.7625000000000001 | 0 |
| 0.7631944444444444 | 0 |
| 0.7638888888888888 | 0 |
| 0.7645833333333334 | 0 |
| 0.7652777777777778 | 0 |
| 0.7659722222222222 | 0 |
| 0.7666666666666666 | 0 |
| 0.7673611111111112 | 0 |
| 0.7680555555555556 | 0 |
| 0.7687499999999999 | 0 |
| 0.7694444444444444 | 0 |
| 0.7701388888888889 | 0 |
| 0.7708333333333334 | 0 |
| 0.7715277777777777 | 0 |
| 0.7722222222222223 | 0 |
| 0.7729166666666667 | 0 |
| 0.7736111111111111 | 0 |
| 0.7743055555555555 | 0 |
| 0.775 | 0 |
| 0.7756944444444445 | 0 |
| 0.7763888888888889 | 0 |
| 0.7770833333333332 | 0 |
| 0.7777777777777778 | 0 |
| 0.7784722222222222 | 0 |
| 0.7791666666666667 | 0 |
| 0.779861111111111 | 0 |
| 0.7805555555555556 | 0 |
| 0.78125 | 0 |
| 0.7819444444444444 | 0 |
| 0.782638888888889 | 0 |
| 0.7833333333333333 | 0 |
| 0.7840277777777778 | 0 |
| 0.7847222222222222 | 0 |
| 0.7854166666666668 | 0 |
| 0.7861111111111111 | 0 |
| 0.7868055555555555 | 0 |
| 0.7875 | 0 |
| 0.7881944444444445 | 0 |
| 0.7888888888888889 | 0 |
| 0.7895833333333333 | 0 |
| 0.7902777777777777 | 0 |
| 0.7909722222222223 | 0 |
| 0.7916666666666666 | 0 |
| 0.7923611111111111 | 0 |
| 0.7930555555555556 | 0 |
| 0.7937500000000001 | 0 |
| 0.7944444444444444 | 0 |
| 0.7951388888888888 | 0 |
| 0.7958333333333334 | 0 |
| 0.7965277777777778 | 0 |
| 0.7972222222222222 | 0 |
| 0.7979166666666666 | 0 |
| 0.7986111111111112 | 0 |
| 0.7993055555555556 | 0 |
| 0.7999999999999999 | 0 |
| 0.8006944444444444 | 0 |
| 0.8013888888888889 | 0 |
| 0.8020833333333334 | 0 |
| 0.8027777777777777 | 0 |
| 0.8034722222222223 | 0 |
| 0.8041666666666667 | 0 |
| 0.8048611111111111 | 0 |
| 0.8055555555555555 | 0 |
| 0.80625 | 0 |
| 0.8069444444444445 | 0 |
| 0.8076388888888889 | 0 |
| 0.8083333333333332 | 0 |
| 0.8090277777777778 | 0 |
| 0.8097222222222222 | 0 |
| 0.8104166666666667 | 0 |
| 0.811111111111111 | 0 |
| 0.8118055555555556 | 0 |
| 0.8125 | 0 |
| 0.8131944444444444 | 0 |
| 0.813888888888889 | 0 |
| 0.8145833333333333 | 0 |
| 0.8152777777777778 | 0 |
| 0.8159722222222222 | 0 |
| 0.8166666666666668 | 0 |
| 0.8173611111111111 | 0 |
| 0.8180555555555555 | 0 |
| 0.81875 | 0 |
| 0.8194444444444445 | 0 |
| 0.8201388888888889 | 0 |
| 0.8208333333333333 | 0 |
| 0.8215277777777777 | 0 |
| 0.8222222222222223 | 0 |
| 0.8229166666666666 | 0 |
| 0.8236111111111111 | 0 |
| 0.8243055555555556 | 0 |
| 0.8250000000000001 | 0 |
| 0.8256944444444444 | 0 |
| 0.8263888888888888 | 0 |
| 0.8270833333333334 | 0 |
| 0.8277777777777778 | 0 |
| 0.8284722222222222 | 0 |
| 0.8291666666666666 | 0 |
| 0.8298611111111112 | 0 |
| 0.8305555555555556 | 0 |
| 0.8312499999999999 | 0 |
| 0.8319444444444444 | 0 |
| 0.8326388888888889 | 0 |
| 0.8333333333333334 | 0 |
| 0.8340277777777777 | 0 |
| 0.8347222222222223 | 0 |
| 0.8354166666666667 | 0 |
| 0.8361111111111111 | 0 |
| 0.8368055555555555 | 0 |
| 0.8375 | 0 |
| 0.8381944444444445 | 0 |
| 0.8388888888888889 | 0 |
| 0.8395833333333332 | 0 |
| 0.8402777777777778 | 0 |
| 0.8409722222222222 | 0 |
| 0.8416666666666667 | 0 |
| 0.842361111111111 | 0 |
| 0.8430555555555556 | 0 |
| 0.84375 | 0 |
| 0.8444444444444444 | 0 |
| 0.845138888888889 | 0 |
| 0.8458333333333333 | 0 |
| 0.8465277777777778 | 0 |
| 0.8472222222222222 | 0 |
| 0.8479166666666668 | 0 |
| 0.8486111111111111 | 0 |
| 0.8493055555555555 | 0 |
| 0.85 | 0 |
| 0.8506944444444445 | 0 |
| 0.8513888888888889 | 0 |
| 0.8520833333333333 | 0 |
| 0.8527777777777777 | 0 |
| 0.8534722222222223 | 0 |
| 0.8541666666666666 | 0 |
| 0.8548611111111111 | 0 |
| 0.8555555555555556 | 0 |
| 0.8562500000000001 | 0 |
| 0.8569444444444444 | 0 |
| 0.8576388888888888 | 0 |
| 0.8583333333333334 | 0 |
| 0.8590277777777778 | 0 |
| 0.8597222222222222 | 0 |
| 0.8604166666666666 | 0 |
| 0.8611111111111112 | 0 |
| 0.8618055555555556 | 0 |
| 0.8624999999999999 | 0 |
| 0.8631944444444444 | 0 |
| 0.8638888888888889 | 0 |
| 0.8645833333333334 | 0 |
| 0.8652777777777777 | 0 |
| 0.8659722222222223 | 0 |
| 0.8666666666666667 | 0 |
| 0.8673611111111111 | 0 |
| 0.8680555555555555 | 0 |
| 0.86875 | 0 |
| 0.8694444444444445 | 0 |
| 0.8701388888888889 | 0 |
| 0.8708333333333332 | 0 |
| 0.8715277777777778 | 0 |
| 0.8722222222222222 | 0 |
| 0.8729166666666667 | 0 |
| 0.873611111111111 | 0 |
| 0.8743055555555556 | 0 |
| 0.875 | 0 |
| 0.8756944444444444 | 0 |
| 0.876388888888889 | 0 |
| 0.8770833333333333 | 0 |
| 0.8777777777777778 | 0 |
| 0.8784722222222222 | 0 |
| 0.8791666666666668 | 0 |
| 0.8798611111111111 | 0 |
| 0.8805555555555555 | 0 |
| 0.88125 | 0 |
| 0.8819444444444445 | 0 |
| 0.8826388888888889 | 0 |
| 0.8833333333333333 | 0 |
| 0.8840277777777777 | 0 |
| 0.8847222222222223 | 0 |
| 0.8854166666666666 | 0 |
| 0.8861111111111111 | 0 |
| 0.8868055555555556 | 0 |
| 0.8875000000000001 | 0 |
| 0.8881944444444444 | 0 |
| 0.8888888888888888 | 0 |
| 0.8895833333333334 | 0 |
| 0.8902777777777778 | 0 |
| 0.8909722222222222 | 0 |
| 0.8916666666666666 | 0 |
| 0.8923611111111112 | 0 |
| 0.8930555555555556 | 0 |
| 0.8937499999999999 | 0 |
| 0.8944444444444444 | 0 |
| 0.8951388888888889 | 0 |
| 0.8958333333333334 | 0 |
| 0.8965277777777777 | 0 |
| 0.8972222222222223 | 0 |
| 0.8979166666666667 | 0 |
| 0.8986111111111111 | 0 |
| 0.8993055555555555 | 0 |
| 0.9 | 0 |
| 0.9006944444444445 | 0 |
| 0.9013888888888889 | 0 |
| 0.9020833333333332 | 0 |
| 0.9027777777777778 | 0 |
| 0.9034722222222222 | 0 |
| 0.9041666666666667 | 0 |
| 0.904861111111111 | 0 |
| 0.9055555555555556 | 0 |
| 0.90625 | 0 |
| 0.9069444444444444 | 0 |
| 0.907638888888889 | 0 |
| 0.9083333333333333 | 0 |
| 0.9090277777777778 | 0 |
| 0.9097222222222222 | 0 |
| 0.9104166666666668 | 0 |
| 0.9111111111111111 | 0 |
| 0.9118055555555555 | 0 |
| 0.9125 | 0 |
| 0.9131944444444445 | 0 |
| 0.9138888888888889 | 0 |
| 0.9145833333333333 | 0 |
| 0.9152777777777777 | 0 |
| 0.9159722222222223 | 0 |
| 0.9166666666666666 | 0 |
| 0.9173611111111111 | 0 |
| 0.9180555555555556 | 0 |
| 0.9187500000000001 | 0 |
| 0.9194444444444444 | 0 |
| 0.9201388888888888 | 0 |
| 0.9208333333333334 | 0 |
| 0.9215277777777778 | 0 |
| 0.9222222222222222 | 0 |
| 0.9229166666666666 | 0 |
| 0.9236111111111112 | 0 |
| 0.9243055555555556 | 0 |
| 0.9249999999999999 | 0 |
| 0.9256944444444444 | 0 |
| 0.9263888888888889 | 0 |
| 0.9270833333333334 | 0 |
| 0.9277777777777777 | 0 |
| 0.9284722222222223 | 0 |
| 0.9291666666666667 | 0 |
| 0.9298611111111111 | 0 |
| 0.9305555555555555 | 0 |
| 0.93125 | 0 |
| 0.9319444444444445 | 0 |
| 0.9326388888888889 | 0 |
| 0.9333333333333332 | 0 |
| 0.9340277777777778 | 0 |
| 0.9347222222222222 | 0 |
| 0.9354166666666667 | 0 |
| 0.936111111111111 | 0 |
| 0.9368055555555556 | 0 |
| 0.9375 | 0 |
| 0.9381944444444444 | 0 |
| 0.938888888888889 | 0 |
| 0.9395833333333333 | 0 |
| 0.9402777777777778 | 0 |
| 0.9409722222222222 | 0 |
| 0.9416666666666668 | 0 |
| 0.9423611111111111 | 0 |
| 0.9430555555555555 | 0 |
| 0.94375 | 0 |
| 0.9444444444444445 | 0 |
| 0.9451388888888889 | 0 |
| 0.9458333333333333 | 0 |
| 0.9465277777777777 | 0 |
| 0.9472222222222223 | 0 |
| 0.9479166666666666 | 0 |
| 0.9486111111111111 | 0 |
| 0.9493055555555556 | 0 |
| 0.9500000000000001 | 0 |
| 0.9506944444444444 | 0 |
| 0.9513888888888888 | 0 |
| 0.9520833333333334 | 0 |
| 0.9527777777777778 | 0 |
| 0.9534722222222222 | 0 |
| 0.9541666666666666 | 0 |
| 0.9548611111111112 | 0 |
| 0.9555555555555556 | 0 |
| 0.9562499999999999 | 0 |
| 0.9569444444444444 | 0 |
| 0.9576388888888889 | 0 |
| 0.9583333333333334 | 0 |
| 0.9590277777777777 | 0 |
| 0.9597222222222223 | 0 |
| 0.9604166666666667 | 0 |
| 0.9611111111111111 | 0 |
| 0.9618055555555555 | 0 |
| 0.9625 | 0 |
| 0.9631944444444445 | 0 |
| 0.9638888888888889 | 0 |
| 0.9645833333333332 | 0 |
| 0.9652777777777778 | 0 |
| 0.9659722222222222 | 0 |
| 0.9666666666666667 | 0 |
| 0.967361111111111 | 0 |
| 0.9680555555555556 | 0 |
| 0.96875 | 0 |
| 0.9694444444444444 | 0 |
| 0.970138888888889 | 0 |
| 0.9708333333333333 | 0 |
| 0.9715277777777778 | 0 |
| 0.9722222222222222 | 0 |
| 0.9729166666666668 | 0 |
| 0.9736111111111111 | 0 |
| 0.9743055555555555 | 0 |
| 0.975 | 0 |
| 0.9756944444444445 | 0 |
| 0.9763888888888889 | 0 |
| 0.9770833333333333 | 0 |
| 0.9777777777777777 | 0 |
| 0.9784722222222223 | 0 |
| 0.9791666666666666 | 0 |
| 0.9798611111111111 | 0 |
| 0.9805555555555556 | 0 |
| 0.9812500000000001 | 0 |
| 0.9819444444444444 | 0 |
| 0.9826388888888888 | 0 |
| 0.9833333333333334 | 0 |
| 0.9840277777777778 | 0 |
| 0.9847222222222222 | 0 |
| 0.9854166666666666 | 0 |
| 0.9861111111111112 | 0 |
| 0.9868055555555556 | 0 |
| 0.9874999999999999 | 0 |
| 0.9881944444444444 | 0 |
| 0.9888888888888889 | 0 |
| 0.9895833333333334 | 0 |
| 0.9902777777777777 | 0 |
| 0.9909722222222223 | 0 |
| 0.9916666666666667 | 0 |
| 0.9923611111111111 | 0 |
| 0.9930555555555555 | 0 |
| 0.99375 | 0 |
| 0.9944444444444445 | 0 |
| 0.9951388888888889 | 0 |
| 0.9958333333333332 | 0 |
| 0.9965277777777778 | 0 |
| 0.9972222222222222 | 0 |
| 0.9979166666666667 | 0 |
| 0.998611111111111 | 0 |
| 0.9993055555555556 | 0 |